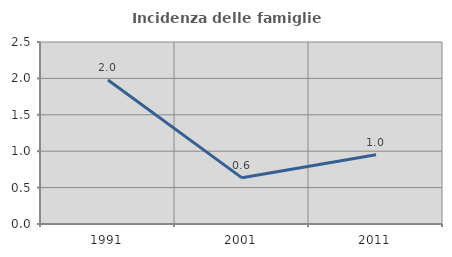
| Category | Incidenza delle famiglie numerose |
|---|---|
| 1991.0 | 1.977 |
| 2001.0 | 0.634 |
| 2011.0 | 0.951 |